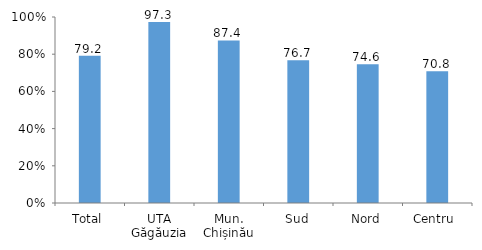
| Category | Series 0 |
|---|---|
| Total | 79.2 |
| UTA Găgăuzia | 97.3 |
| Mun. Chișinău | 87.4 |
| Sud | 76.7 |
| Nord | 74.6 |
| Centru  | 70.8 |